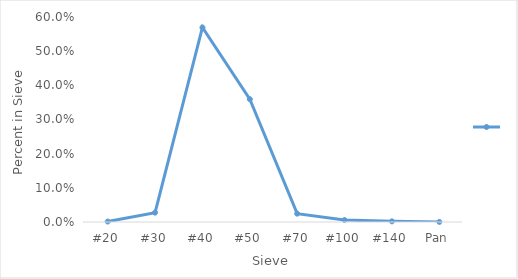
| Category | Series 0 |
|---|---|
| #20 | 0.001 |
| #30 | 0.027 |
| #40 | 0.569 |
| #50 | 0.36 |
| #70 | 0.024 |
| #100 | 0.006 |
| #140 | 0.002 |
| Pan | 0 |